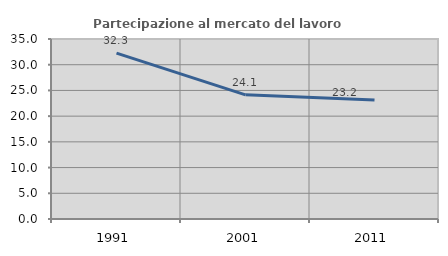
| Category | Partecipazione al mercato del lavoro  femminile |
|---|---|
| 1991.0 | 32.252 |
| 2001.0 | 24.138 |
| 2011.0 | 23.161 |